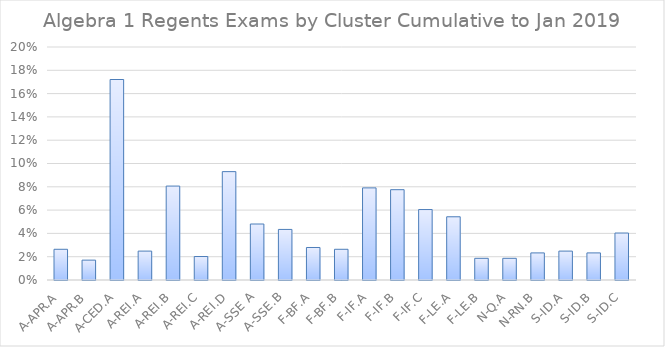
| Category | Series 0 |
|---|---|
| A-APR.A | 0.026 |
| A-APR.B | 0.017 |
| A-CED.A | 0.172 |
| A-REI.A | 0.025 |
| A-REI.B | 0.081 |
| A-REI.C | 0.02 |
| A-REI.D | 0.093 |
| A-SSE A | 0.048 |
| A-SSE.B | 0.043 |
| F-BF.A | 0.028 |
| F-BF.B | 0.026 |
| F-IF.A | 0.079 |
| F-IF.B | 0.078 |
| F-IF.C | 0.06 |
| F-LE.A | 0.054 |
| F-LE.B | 0.019 |
| N-Q.A | 0.019 |
| N-RN.B | 0.023 |
| S-ID.A | 0.025 |
| S-ID.B | 0.023 |
| S-ID.C | 0.04 |